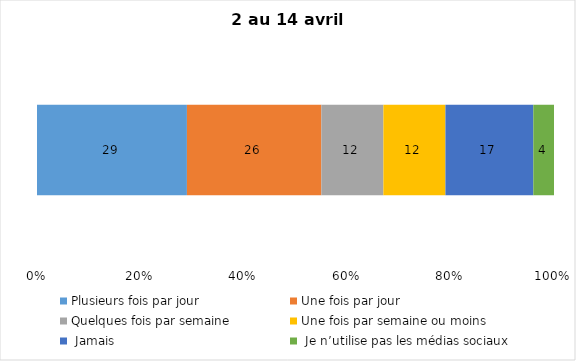
| Category | Plusieurs fois par jour | Une fois par jour | Quelques fois par semaine   | Une fois par semaine ou moins   |  Jamais   |  Je n’utilise pas les médias sociaux |
|---|---|---|---|---|---|---|
| 0 | 29 | 26 | 12 | 12 | 17 | 4 |